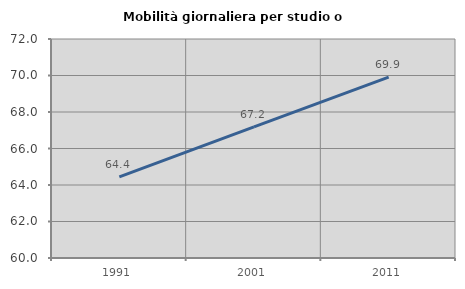
| Category | Mobilità giornaliera per studio o lavoro |
|---|---|
| 1991.0 | 64.442 |
| 2001.0 | 67.186 |
| 2011.0 | 69.908 |